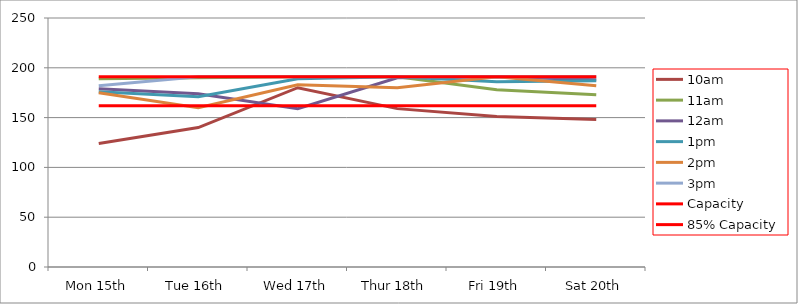
| Category | 9am | 10am | 11am | 12am | 1pm | 2pm | 3pm | 4pm | 5pm | Capacity | 85% Capacity |
|---|---|---|---|---|---|---|---|---|---|---|---|
| Mon 15th |  | 124 | 189 | 179 | 176 | 175 | 182 |  |  | 191 | 162 |
| Tue 16th |  | 140 | 190 | 174 | 171 | 160 | 191 |  |  | 191 | 162 |
| Wed 17th |  | 180 | 191 | 159 | 189 | 183 | 191 |  |  | 191 | 162 |
| Thur 18th |  | 159 | 191 | 190 | 191 | 180 | 191 |  |  | 191 | 162 |
| Fri 19th |  | 151 | 178 | 191 | 186 | 191 | 191 |  |  | 191 | 162 |
| Sat 20th |  | 148 | 173 | 188 | 187 | 182 | 191 |  |  | 191 | 162 |